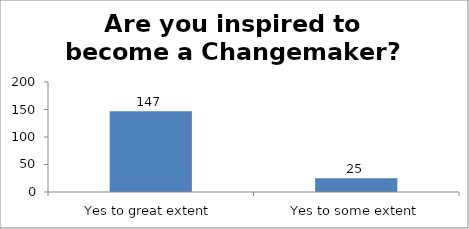
| Category | Are you inspired to become a Changemaker?   |
|---|---|
| Yes to great extent | 147 |
| Yes to some extent | 25 |